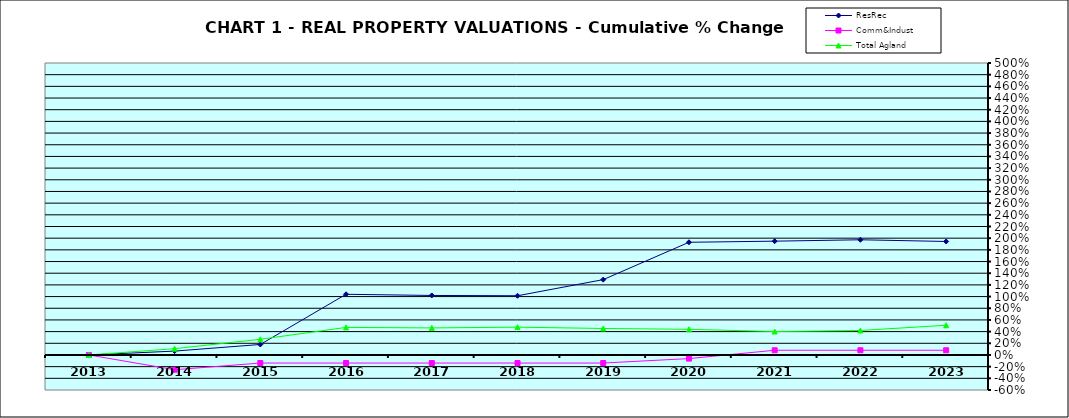
| Category | ResRec | Comm&Indust | Total Agland |
|---|---|---|---|
| 2013.0 | 0 | 0 | 0 |
| 2014.0 | 0.066 | -0.253 | 0.108 |
| 2015.0 | 0.18 | -0.138 | 0.268 |
| 2016.0 | 1.039 | -0.138 | 0.472 |
| 2017.0 | 1.019 | -0.138 | 0.463 |
| 2018.0 | 1.014 | -0.138 | 0.476 |
| 2019.0 | 1.29 | -0.138 | 0.454 |
| 2020.0 | 1.93 | -0.062 | 0.439 |
| 2021.0 | 1.949 | 0.081 | 0.401 |
| 2022.0 | 1.973 | 0.081 | 0.419 |
| 2023.0 | 1.944 | 0.081 | 0.509 |